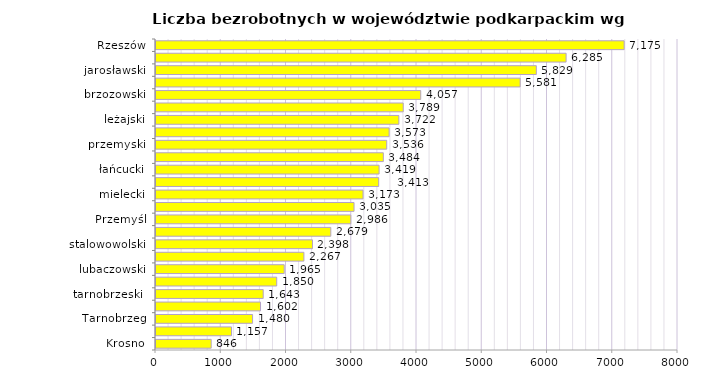
| Category | Liczba bezrobotnych w województwie podkarpackim wg powiatów |
|---|---|
| Krosno | 846 |
| bieszczadzki | 1157 |
| Tarnobrzeg | 1480 |
| leski | 1602 |
| tarnobrzeski  | 1643 |
| kolbuszowski | 1850 |
| lubaczowski | 1965 |
| krośnieński | 2267 |
| stalowowolski | 2398 |
| sanocki | 2679 |
| Przemyśl | 2986 |
| dębicki | 3035 |
| mielecki | 3173 |
| ropczycko-sędziszowski | 3413 |
| łańcucki | 3419 |
| niżański | 3484 |
| przemyski | 3536 |
| strzyżowski | 3573 |
| leżajski | 3722 |
| przeworski | 3789 |
| brzozowski | 4057 |
| jasielski | 5581 |
| jarosławski | 5829 |
| rzeszowski | 6285 |
| Rzeszów | 7175 |